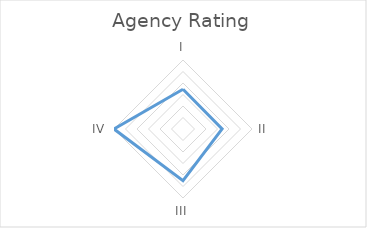
| Category | Series 0 |
|---|---|
| I | 1.727 |
| II | 1.7 |
| III | 2.25 |
| IV | 3 |